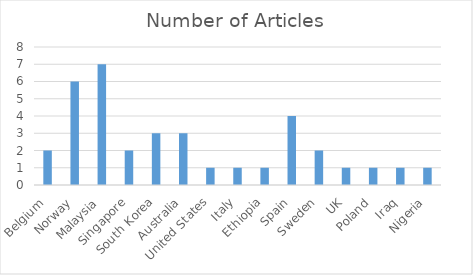
| Category | Number of Articles |
|---|---|
| Belgium | 2 |
| Norway | 6 |
| Malaysia | 7 |
| Singapore | 2 |
| South Korea | 3 |
| Australia | 3 |
| United States | 1 |
| Italy | 1 |
| Ethiopia | 1 |
| Spain | 4 |
| Sweden | 2 |
| UK | 1 |
| Poland | 1 |
| Iraq | 1 |
| Nigeria | 1 |